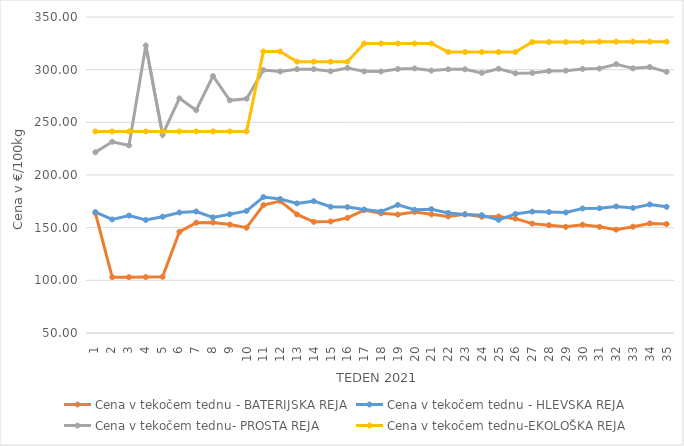
| Category | Cena v tekočem tednu - BATERIJSKA REJA | Cena v tekočem tednu - HLEVSKA REJA | Cena v tekočem tednu- PROSTA REJA | Cena v tekočem tednu-EKOLOŠKA REJA |
|---|---|---|---|---|
| 1.0 | 163.81 | 164.86 | 221.55 | 241.38 |
| 2.0 | 103.02 | 157.81 | 231.55 | 241.38 |
| 3.0 | 103.03 | 161.48 | 228.1 | 241.38 |
| 4.0 | 103.15 | 157.29 | 322.93 | 241.38 |
| 5.0 | 103.34 | 160.43 | 238.28 | 241.38 |
| 6.0 | 146.03 | 164.39 | 272.76 | 241.38 |
| 7.0 | 154.77 | 165.34 | 261.55 | 241.38 |
| 8.0 | 154.86 | 159.79 | 293.97 | 241.38 |
| 9.0 | 153 | 162.73 | 270.86 | 241.38 |
| 10.0 | 149.98 | 165.85 | 272.41 | 241.38 |
| 11.0 | 171.4 | 179.09 | 299.66 | 317.24 |
| 12.0 | 175.2 | 177.21 | 298.27 | 317.24 |
| 13.0 | 162.57 | 173.07 | 300.45 | 307.59 |
| 14.0 | 155.55 | 175.17 | 300.49 | 307.59 |
| 15.0 | 155.88 | 169.83 | 298.52 | 307.59 |
| 16.0 | 159.26 | 169.55 | 301.6 | 307.59 |
| 17.0 | 166.66 | 167.25 | 298.38 | 324.83 |
| 18.0 | 163.58 | 165.28 | 298.35 | 324.83 |
| 19.0 | 162.44 | 171.6 | 300.59 | 324.83 |
| 20.0 | 164.94 | 167.01 | 301.21 | 324.83 |
| 21.0 | 162.64 | 167.56 | 299.14 | 324.83 |
| 22.0 | 160.68 | 164.01 | 300.34 | 316.72 |
| 23.0 | 162.75 | 162.58 | 300.35 | 316.72 |
| 24.0 | 160.34 | 161.89 | 296.9 | 316.72 |
| 25.0 | 160.61 | 157.42 | 300.86 | 316.72 |
| 26.0 | 158.57 | 163.03 | 296.55 | 316.72 |
| 27.0 | 153.83 | 165.23 | 296.9 | 326.21 |
| 28.0 | 152.35 | 164.83 | 298.63 | 326.21 |
| 29.0 | 150.79 | 164.42 | 299.08 | 326.21 |
| 30.0 | 152.82 | 168.2 | 300.63 | 326.21 |
| 31.0 | 150.8 | 168.4 | 301.07 | 326.55 |
| 32.0 | 148.1 | 170.19 | 305.2 | 326.55 |
| 33.0 | 150.88 | 168.74 | 301.25 | 326.55 |
| 34.0 | 154.04 | 172.03 | 302.51 | 326.55 |
| 35.0 | 153.37 | 169.81 | 297.92 | 326.55 |